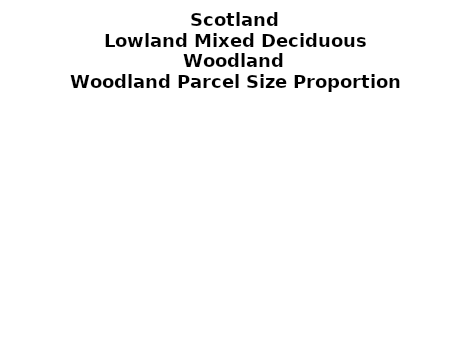
| Category | Lowland Mixed Deciduous Woodland |
|---|---|
| <5 ha | 0.276 |
| ≥5 and <10 ha | 0.101 |
| ≥10 and <15 ha | 0.061 |
| ≥15 and <20 ha | 0.036 |
| ≥20 and <25 ha | 0.043 |
| ≥25 and <30 ha | 0.033 |
| ≥30 and <35 ha | 0.039 |
| ≥35 and <40 ha | 0.017 |
| ≥40 and <45 ha | 0.026 |
| ≥45 and <50 ha | 0.021 |
| ≥50 and <60 ha | 0.035 |
| ≥60 and <70 ha | 0.019 |
| ≥70 and <80 ha | 0.016 |
| ≥80 and <90 ha | 0.016 |
| ≥90 and <100 ha | 0.029 |
| ≥100 and <150 ha | 0.067 |
| ≥150 and <200 ha | 0.024 |
| ≥200 ha | 0.139 |